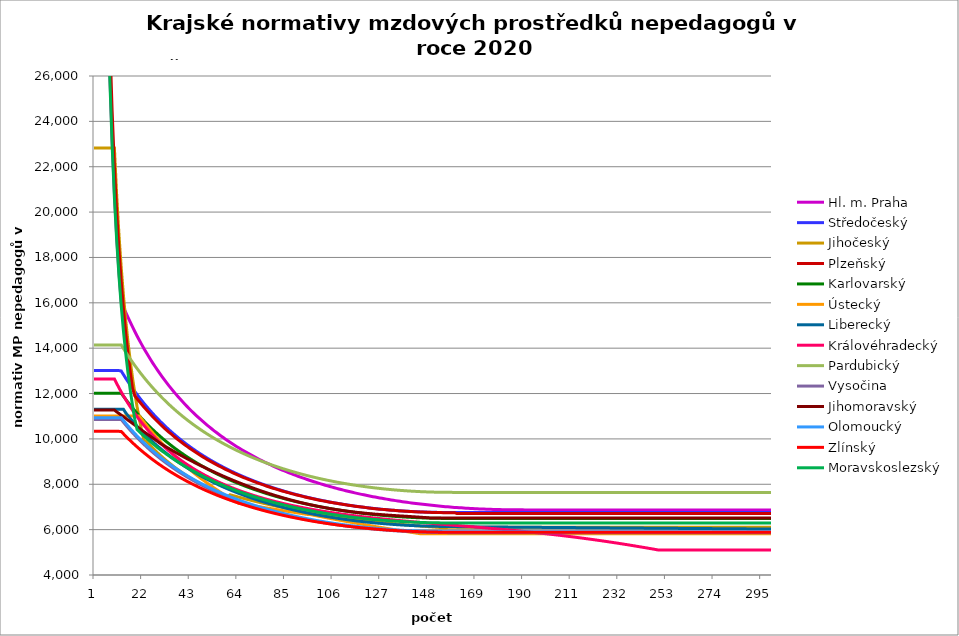
| Category | Hl. m. Praha | Středočeský | Jihočeský | Plzeňský | Karlovarský  | Ústecký   | Liberecký | Královéhradecký | Pardubický | Vysočina | Jihomoravský | Olomoucký | Zlínský | Moravskoslezský |
|---|---|---|---|---|---|---|---|---|---|---|---|---|---|---|
| 0 | 208320 | 13011.111 | 22826.448 | 219984 | 12015.95 | 11012.324 | 11306.231 | 12641.778 | 14143.911 | 10858.532 | 11272.666 | 10937.037 | 10332.651 | 206400 |
| 1 | 104160 | 13011.111 | 22826.448 | 109992 | 12015.95 | 11012.324 | 11306.231 | 12641.778 | 14143.911 | 10858.532 | 11272.666 | 10937.037 | 10332.651 | 103200 |
| 2 | 69440 | 13011.111 | 22826.448 | 73328 | 12015.95 | 11012.324 | 11306.231 | 12641.778 | 14143.911 | 10858.532 | 11272.666 | 10937.037 | 10332.651 | 68800 |
| 3 | 52080 | 13011.111 | 22826.448 | 54996 | 12015.95 | 11012.324 | 11306.231 | 12641.778 | 14143.911 | 10858.532 | 11272.666 | 10937.037 | 10332.651 | 51600 |
| 4 | 41664 | 13011.111 | 22826.448 | 43996.8 | 12015.95 | 11012.324 | 11306.231 | 12641.778 | 14143.911 | 10858.532 | 11272.666 | 10937.037 | 10332.651 | 41280 |
| 5 | 34720 | 13011.111 | 22826.448 | 36664 | 12015.95 | 11012.324 | 11306.231 | 12641.778 | 14143.911 | 10858.532 | 11272.666 | 10937.037 | 10332.651 | 34400 |
| 6 | 29760 | 13011.111 | 22826.448 | 31426.286 | 12015.95 | 11012.324 | 11306.231 | 12641.778 | 14143.911 | 10858.532 | 11272.666 | 10937.037 | 10332.651 | 29485.714 |
| 7 | 26040 | 13011.111 | 22826.448 | 27498 | 12015.95 | 11012.324 | 11306.231 | 12641.778 | 14143.911 | 10858.532 | 11272.666 | 10937.037 | 10332.651 | 25800 |
| 8 | 23146.667 | 13011.111 | 22826.448 | 24442.667 | 12015.95 | 11012.324 | 11306.231 | 12641.778 | 14143.911 | 10858.532 | 11272.666 | 10937.037 | 10332.651 | 22933.333 |
| 9 | 20832 | 13011.111 | 22826.448 | 21998.4 | 12015.95 | 11012.324 | 11306.231 | 12641.778 | 14143.911 | 10858.532 | 11272.666 | 10937.037 | 10332.651 | 20640 |
| 10 | 18938.182 | 13011.111 | 20751.316 | 19998.545 | 12015.95 | 11012.324 | 11306.231 | 12445.114 | 14143.911 | 10858.532 | 11191.909 | 10937.037 | 10332.651 | 18763.636 |
| 11 | 17360 | 13011.111 | 19022.04 | 18332 | 12015.95 | 11012.324 | 11306.231 | 12254.476 | 14143.911 | 10858.532 | 11121.608 | 10937.037 | 10332.651 | 17200 |
| 12 | 16054.056 | 12995.318 | 17558.806 | 16921.846 | 12016.057 | 11012.324 | 11306.231 | 12069.59 | 14144.036 | 10858.532 | 11047.587 | 10937.037 | 10328.67 | 15876.923 |
| 13 | 15814.598 | 12832.408 | 16304.606 | 15713.143 | 11878.17 | 11012.324 | 11306.231 | 11895.725 | 13981.73 | 10733.953 | 10974.545 | 10808.366 | 10223.34 | 14742.857 |
| 14 | 15583.483 | 12674.618 | 15217.632 | 14665.6 | 11744.327 | 11012.324 | 11146.971 | 11732.172 | 13824.185 | 10613.014 | 10902.463 | 10687.29 | 10120.838 | 13760 |
| 15 | 15360.294 | 12521.721 | 14266.53 | 13749 | 11614.362 | 11012.324 | 11022.551 | 11567.826 | 13671.203 | 10495.566 | 10826.906 | 10568.896 | 10021.06 | 12900 |
| 16 | 15144.642 | 12373.503 | 13427.322 | 12940.235 | 11488.118 | 11012.324 | 10901.716 | 11413.107 | 13522.602 | 10381.466 | 10756.744 | 10453.097 | 9923.905 | 12141.176 |
| 17 | 14936.16 | 12229.765 | 12681.36 | 12221.333 | 11365.446 | 11012.324 | 10784.322 | 11262.473 | 13378.206 | 10270.583 | 10683.186 | 10344.12 | 9829.278 | 11466.667 |
| 18 | 14734.507 | 12090.316 | 12013.92 | 11898.745 | 11246.206 | 11012.324 | 10670.232 | 11120.591 | 13237.849 | 10162.789 | 10610.627 | 10233.168 | 9737.088 | 10863.158 |
| 19 | 14539.363 | 11954.977 | 11413.224 | 11771.404 | 11130.263 | 11012.324 | 10559.318 | 10982.239 | 13101.374 | 10057.965 | 10534.867 | 10128.706 | 9647.249 | 10417.508 |
| 20 | 14350.428 | 11823.58 | 10869.737 | 11646.76 | 11017.493 | 11012.324 | 10451.456 | 10847.288 | 12968.632 | 9956.354 | 10464.303 | 10026.354 | 9559.679 | 10320.021 |
| 21 | 14167.419 | 11695.965 | 10375.658 | 11524.728 | 10907.775 | 10878.261 | 10346.53 | 10720.101 | 12839.483 | 9857.128 | 10390.61 | 9926.05 | 9474.299 | 10225.03 |
| 22 | 13990.072 | 11571.98 | 9924.543 | 11405.226 | 10800.994 | 10747.423 | 10244.431 | 10595.861 | 12713.792 | 9760.547 | 10317.949 | 9831.629 | 9391.036 | 10132.448 |
| 23 | 13818.136 | 11451.483 | 9908.446 | 11292.813 | 10697.043 | 10619.694 | 10145.052 | 10478.756 | 12591.433 | 9666.515 | 10246.296 | 9735.165 | 9309.817 | 10042.193 |
| 24 | 13651.376 | 11334.338 | 9798.737 | 11182.595 | 10595.819 | 10494.966 | 10048.296 | 10360.016 | 12472.282 | 9575.271 | 10175.632 | 9644.323 | 9230.575 | 9954.184 |
| 25 | 13489.572 | 11220.416 | 9692.54 | 11074.507 | 10497.225 | 10373.134 | 9954.066 | 10248.038 | 12356.227 | 9486.059 | 10105.936 | 9555.162 | 9153.244 | 9868.346 |
| 26 | 13332.514 | 11109.596 | 9589.707 | 10968.488 | 10401.166 | 10258.303 | 9862.274 | 10142.472 | 12243.157 | 9399.131 | 10033.396 | 9467.634 | 9077.763 | 9784.606 |
| 27 | 13180.005 | 11001.762 | 9490.097 | 10864.48 | 10307.554 | 10141.873 | 9772.832 | 10035.123 | 12132.967 | 9314.722 | 9961.89 | 9381.694 | 9004.073 | 9702.896 |
| 28 | 13031.859 | 10896.803 | 9393.578 | 10766.641 | 10216.305 | 10028.056 | 9685.66 | 9937.733 | 12025.558 | 9232.123 | 9891.397 | 9297.301 | 8932.115 | 9623.149 |
| 29 | 12887.899 | 10794.617 | 9300.023 | 10666.408 | 10127.339 | 9916.766 | 9600.68 | 9838.432 | 11920.836 | 9151.884 | 9818.262 | 9217.837 | 8861.837 | 9545.303 |
| 30 | 12747.959 | 10695.102 | 9209.316 | 10572.088 | 10040.577 | 9807.918 | 9517.817 | 9744.804 | 11818.709 | 9073.621 | 9756.943 | 9136.354 | 8793.187 | 9469.297 |
| 31 | 12611.88 | 10598.164 | 9121.343 | 10479.421 | 9955.947 | 9701.435 | 9437 | 9652.941 | 11719.092 | 8996.979 | 9696.386 | 9059.606 | 8726.113 | 9395.074 |
| 32 | 12479.512 | 10503.714 | 9036 | 10392.29 | 9873.379 | 9597.238 | 9358.161 | 9562.794 | 11621.902 | 8922.195 | 9636.575 | 8984.136 | 8660.569 | 9322.577 |
| 33 | 12350.715 | 10411.665 | 8953.186 | 10302.735 | 9792.806 | 9495.256 | 9281.237 | 9477.823 | 11527.059 | 8849.492 | 9577.497 | 8913.115 | 8596.508 | 9251.755 |
| 34 | 12225.352 | 10321.936 | 8872.806 | 10218.506 | 9714.163 | 9395.419 | 9206.165 | 9394.349 | 11434.489 | 8778.521 | 9519.14 | 8840.057 | 8533.888 | 9182.557 |
| 35 | 12103.296 | 10234.448 | 8794.77 | 10131.909 | 9637.39 | 9297.659 | 9132.885 | 9312.332 | 11344.12 | 8709.227 | 9461.489 | 8771.287 | 8472.665 | 9114.933 |
| 36 | 11984.426 | 10149.128 | 8718.993 | 10050.439 | 9562.427 | 9201.912 | 9061.343 | 9235.065 | 11255.882 | 8641.288 | 9404.533 | 8703.579 | 8412.799 | 9048.837 |
| 37 | 11868.625 | 10065.903 | 8645.394 | 9970.268 | 9489.22 | 9111.435 | 8991.482 | 9159.07 | 11169.71 | 8575.197 | 9348.258 | 8636.908 | 8354.252 | 8984.225 |
| 38 | 11755.783 | 9984.705 | 8573.895 | 9894.926 | 9417.713 | 9019.466 | 8923.253 | 9084.315 | 11085.54 | 8510.372 | 9292.652 | 8571.251 | 8296.985 | 8921.054 |
| 39 | 11645.796 | 9905.471 | 8504.423 | 9817.208 | 9347.856 | 8929.336 | 8856.604 | 9010.771 | 11003.311 | 8447.291 | 9237.704 | 8506.584 | 8240.964 | 8859.282 |
| 40 | 11538.564 | 9828.137 | 8436.909 | 9744.153 | 9279.599 | 8840.989 | 8791.489 | 8941.53 | 10922.967 | 8385.901 | 9183.402 | 8445.761 | 8186.153 | 8798.869 |
| 41 | 11433.991 | 9752.644 | 8371.286 | 9672.177 | 9212.895 | 8754.374 | 8727.861 | 8873.345 | 10844.45 | 8325.397 | 9129.735 | 8385.801 | 8132.52 | 8739.778 |
| 42 | 11331.987 | 9678.936 | 8307.491 | 9601.257 | 9147.699 | 8669.439 | 8665.677 | 8809.222 | 10767.707 | 8266.5 | 9079.795 | 8323.893 | 8080.032 | 8681.972 |
| 43 | 11232.465 | 9606.957 | 8245.465 | 9531.369 | 9083.966 | 8586.136 | 8604.896 | 8743.033 | 10692.688 | 8208.916 | 9027.328 | 8268.4 | 8028.66 | 8625.416 |
| 44 | 11135.343 | 9536.656 | 8185.149 | 9462.491 | 9021.656 | 8504.419 | 8545.476 | 8680.773 | 10619.343 | 8152.61 | 8975.465 | 8210.924 | 7978.372 | 8570.076 |
| 45 | 11040.541 | 9467.982 | 8126.489 | 9397.813 | 8960.727 | 8424.242 | 8487.38 | 8619.394 | 10547.624 | 8097.781 | 8924.194 | 8154.241 | 7929.142 | 8515.919 |
| 46 | 10947.984 | 9400.887 | 8069.433 | 9334.012 | 8901.142 | 8345.564 | 8430.569 | 8561.739 | 10477.487 | 8043.684 | 8873.505 | 8100.98 | 7880.941 | 8462.915 |
| 47 | 10857.6 | 9335.326 | 8013.932 | 9271.072 | 8842.863 | 8268.341 | 8375.009 | 8504.85 | 10408.887 | 7990.997 | 8823.389 | 8048.41 | 7833.743 | 8411.032 |
| 48 | 10769.32 | 9271.254 | 7959.937 | 9208.975 | 8785.855 | 8195.218 | 8320.664 | 8448.713 | 10341.782 | 7939.451 | 8776.735 | 7996.518 | 7787.522 | 8360.242 |
| 49 | 10683.077 | 9208.629 | 7907.404 | 9147.705 | 8730.082 | 8120.74 | 8267.503 | 8393.311 | 10276.133 | 7889.24 | 8727.703 | 7945.291 | 7742.255 | 8310.517 |
| 50 | 10598.808 | 9147.41 | 7856.288 | 9087.244 | 8675.513 | 8047.604 | 8215.492 | 8341.349 | 10211.9 | 7839.882 | 8679.216 | 7894.717 | 7697.917 | 8261.83 |
| 51 | 10516.453 | 9087.558 | 7806.549 | 9030.542 | 8622.115 | 7975.773 | 8164.602 | 8290.026 | 10149.045 | 7791.576 | 8631.264 | 7847.264 | 7654.485 | 8214.154 |
| 52 | 10435.954 | 9029.035 | 7758.147 | 8974.543 | 8569.858 | 7905.213 | 8114.803 | 8239.331 | 10087.534 | 7744.295 | 8586.615 | 7800.377 | 7611.938 | 8167.465 |
| 53 | 10357.254 | 8971.805 | 7711.044 | 8919.235 | 8518.712 | 7835.891 | 8066.067 | 8189.251 | 10027.33 | 7698.013 | 8539.678 | 7754.048 | 7570.253 | 8121.738 |
| 54 | 10280.3 | 8915.834 | 7665.203 | 8864.603 | 8468.649 | 7767.774 | 8018.366 | 8142.366 | 9968.401 | 7652.914 | 8493.252 | 7708.266 | 7529.412 | 8076.95 |
| 55 | 10205.041 | 8861.087 | 7620.59 | 8813.462 | 8419.641 | 7700.831 | 7971.674 | 8096.015 | 9910.714 | 7608.759 | 8450.016 | 7663.021 | 7489.393 | 8033.079 |
| 56 | 10131.428 | 8807.533 | 7577.172 | 8760.115 | 8371.662 | 7635.032 | 7925.966 | 8050.189 | 9854.239 | 7565.317 | 8404.557 | 7618.305 | 7450.177 | 7990.102 |
| 57 | 10059.414 | 8755.14 | 7534.916 | 8710.168 | 8324.687 | 7570.348 | 7881.217 | 8007.382 | 9798.945 | 7522.777 | 8359.585 | 7576.42 | 7411.747 | 7947.999 |
| 58 | 9988.952 | 8703.879 | 7493.792 | 8660.787 | 8278.692 | 7506.751 | 7837.404 | 7962.551 | 9744.804 | 7481.117 | 8317.695 | 7534.994 | 7374.083 | 7906.749 |
| 59 | 9920 | 8653.722 | 7453.771 | 8611.964 | 8233.651 | 7446.429 | 7794.504 | 7920.668 | 9691.787 | 7440.516 | 8273.645 | 7494.018 | 7337.17 | 7866.333 |
| 60 | 9852.515 | 8604.639 | 7537.567 | 8563.687 | 8189.543 | 7384.888 | 7752.495 | 7881.65 | 9639.868 | 7400.748 | 8232.61 | 7453.486 | 7300.989 | 7826.732 |
| 61 | 9786.457 | 8556.606 | 7509.433 | 8518.587 | 8146.346 | 7324.356 | 7711.356 | 7840.613 | 9589.02 | 7361.599 | 8189.454 | 7413.389 | 7265.525 | 7787.927 |
| 62 | 9721.787 | 8509.595 | 7481.701 | 8471.349 | 8104.038 | 7264.808 | 7671.066 | 7802.377 | 9539.219 | 7323.443 | 8149.248 | 7375.914 | 7230.762 | 7749.9 |
| 63 | 9658.467 | 8463.582 | 7454.365 | 8427.214 | 8062.598 | 7206.221 | 7631.606 | 7764.513 | 9490.441 | 7285.872 | 8106.96 | 7338.817 | 7196.686 | 7712.636 |
| 64 | 9596.462 | 8418.543 | 7427.419 | 8383.537 | 8022.007 | 7148.571 | 7592.956 | 7727.015 | 9442.662 | 7249.254 | 8067.558 | 7299.941 | 7163.28 | 7676.116 |
| 65 | 9535.737 | 8374.455 | 7400.856 | 8340.309 | 7982.246 | 7148.571 | 7555.098 | 7689.877 | 9395.859 | 7213.378 | 8028.537 | 7263.602 | 7130.532 | 7640.324 |
| 66 | 9476.258 | 8331.295 | 7374.671 | 8297.526 | 7943.296 | 7130.237 | 7518.015 | 7655.383 | 9350.011 | 7178.227 | 7989.892 | 7229.729 | 7098.427 | 7605.246 |
| 67 | 9417.994 | 8289.043 | 7348.857 | 8257.658 | 7905.138 | 7114.018 | 7481.689 | 7621.197 | 9305.096 | 7143.602 | 7951.617 | 7194.084 | 7066.952 | 7570.867 |
| 68 | 9360.913 | 8247.677 | 7323.409 | 8218.171 | 7867.757 | 7095.859 | 7446.103 | 7587.315 | 9261.094 | 7109.856 | 7913.707 | 7160.855 | 7036.094 | 7537.171 |
| 69 | 9304.985 | 8207.177 | 7298.32 | 8179.06 | 7831.134 | 7079.796 | 7411.242 | 7553.733 | 9217.986 | 7076.789 | 7876.157 | 7127.931 | 7005.841 | 7504.145 |
| 70 | 9250.181 | 8167.524 | 7273.586 | 8140.32 | 7795.254 | 7061.812 | 7377.089 | 7522.656 | 9175.752 | 7044.387 | 7838.961 | 7095.309 | 6976.181 | 7471.775 |
| 71 | 9196.474 | 8128.699 | 7249.201 | 8101.945 | 7760.101 | 7043.919 | 7343.63 | 7489.643 | 9134.373 | 7012.636 | 7802.115 | 7062.984 | 6947.101 | 7440.047 |
| 72 | 9143.836 | 8090.683 | 7225.159 | 8063.93 | 7725.659 | 7028.09 | 7310.851 | 7459.091 | 9093.832 | 6981.345 | 7767.885 | 7030.952 | 6918.591 | 7408.95 |
| 73 | 9092.242 | 8053.46 | 7201.455 | 8028.613 | 7691.915 | 7010.367 | 7278.736 | 7428.787 | 9054.112 | 6950.856 | 7731.703 | 7001.185 | 6890.639 | 7378.47 |
| 74 | 9041.667 | 8017.013 | 7178.084 | 7993.605 | 7658.853 | 6992.733 | 7247.273 | 7400.867 | 9015.195 | 6921.151 | 7698.087 | 6969.711 | 6863.235 | 7348.595 |
| 75 | 8992.085 | 7981.325 | 7155.042 | 7958.9 | 7626.461 | 6977.133 | 7216.448 | 7371.034 | 8977.066 | 6891.87 | 7664.762 | 6940.459 | 6836.368 | 7319.315 |
| 76 | 8943.475 | 7946.379 | 7132.323 | 7924.496 | 7594.724 | 6959.666 | 7186.248 | 7343.546 | 8939.709 | 6863.176 | 7629.532 | 6911.452 | 6810.029 | 7290.617 |
| 77 | 8895.812 | 7912.162 | 7109.922 | 7890.387 | 7563.63 | 6944.213 | 7156.661 | 7316.262 | 8903.108 | 6835.057 | 7596.796 | 6882.686 | 6784.207 | 7262.491 |
| 78 | 8849.076 | 7878.658 | 7087.836 | 7858.817 | 7533.166 | 6926.91 | 7127.675 | 7289.18 | 8867.249 | 6807.502 | 7566.496 | 6856.053 | 6758.893 | 7234.926 |
| 79 | 8803.245 | 7845.852 | 7066.059 | 7825.27 | 7503.32 | 6909.693 | 7099.279 | 7264.359 | 8832.118 | 6780.501 | 7534.298 | 6829.626 | 6734.079 | 7207.912 |
| 80 | 8758.299 | 7813.732 | 7044.587 | 7794.218 | 7474.08 | 6894.461 | 7071.46 | 7237.659 | 8797.7 | 6754.207 | 7502.373 | 6801.536 | 6709.754 | 7181.438 |
| 81 | 8714.218 | 7782.282 | 7023.416 | 7763.411 | 7445.436 | 6877.405 | 7044.209 | 7213.187 | 8763.983 | 6728.28 | 7472.819 | 6775.526 | 6685.911 | 7155.496 |
| 82 | 8670.982 | 7751.491 | 7002.541 | 7735.021 | 7417.375 | 6860.433 | 7017.514 | 7188.88 | 8730.953 | 6702.875 | 7443.498 | 6749.714 | 6662.54 | 7130.076 |
| 83 | 8628.574 | 7721.346 | 6981.958 | 7704.679 | 7389.887 | 6845.417 | 6991.366 | 7164.736 | 8698.597 | 6677.984 | 7412.336 | 6725.922 | 6639.635 | 7105.167 |
| 84 | 8586.974 | 7691.834 | 6961.664 | 7676.717 | 7362.963 | 6828.603 | 6965.754 | 7140.753 | 8666.904 | 6653.757 | 7385.539 | 6700.486 | 6617.187 | 7080.763 |
| 85 | 8546.167 | 7662.944 | 6941.653 | 7646.83 | 7336.59 | 6813.725 | 6940.669 | 7118.91 | 8635.861 | 6630.022 | 7356.898 | 6677.039 | 6595.188 | 7056.854 |
| 86 | 8506.135 | 7634.664 | 6921.923 | 7619.285 | 7310.761 | 6797.066 | 6916.101 | 7095.233 | 8605.458 | 6606.613 | 7328.477 | 6653.755 | 6573.631 | 7033.432 |
| 87 | 8466.861 | 7606.983 | 6902.47 | 7591.938 | 7285.466 | 6780.488 | 6892.042 | 7073.667 | 8575.683 | 6583.682 | 7302.282 | 6630.634 | 6552.509 | 7010.489 |
| 88 | 8428.33 | 7579.891 | 6883.29 | 7566.868 | 7260.694 | 6765.819 | 6868.482 | 7052.231 | 8546.524 | 6561.221 | 7276.274 | 6607.672 | 6531.814 | 6988.016 |
| 89 | 8390.527 | 7553.377 | 6864.379 | 7539.896 | 7236.438 | 6749.393 | 6845.413 | 7032.857 | 8517.973 | 6539.375 | 7250.45 | 6586.617 | 6511.54 | 6966.007 |
| 90 | 8353.436 | 7527.43 | 6845.733 | 7515.168 | 7212.689 | 6733.046 | 6822.827 | 7011.668 | 8490.018 | 6517.982 | 7224.81 | 6563.959 | 6491.681 | 6944.454 |
| 91 | 8317.044 | 7502.042 | 6827.35 | 7490.602 | 7189.439 | 6718.582 | 6800.716 | 6990.606 | 8462.65 | 6496.88 | 7199.349 | 6543.181 | 6472.229 | 6923.349 |
| 92 | 8281.336 | 7477.202 | 6809.225 | 7466.196 | 7166.678 | 6702.384 | 6779.072 | 6971.569 | 8435.858 | 6476.369 | 7176.006 | 6522.535 | 6453.179 | 6902.687 |
| 93 | 8246.3 | 7452.902 | 6791.356 | 7441.949 | 7144.4 | 6688.051 | 6757.887 | 6952.634 | 8409.635 | 6456.137 | 7152.814 | 6502.018 | 6434.524 | 6882.459 |
| 94 | 8211.921 | 7429.133 | 6773.739 | 7417.858 | 7122.597 | 6672 | 6737.155 | 6933.803 | 8383.971 | 6436.48 | 7129.772 | 6481.631 | 6416.26 | 6862.66 |
| 95 | 8178.186 | 7405.885 | 6756.371 | 7395.912 | 7101.261 | 6672 | 6716.867 | 6915.073 | 8358.856 | 6417.24 | 7106.877 | 6463.054 | 6398.379 | 6843.284 |
| 96 | 8145.085 | 7383.151 | 6739.249 | 7374.095 | 7080.385 | 6652.486 | 6697.018 | 6896.444 | 8334.284 | 6398.41 | 7086.019 | 6444.583 | 6380.876 | 6824.323 |
| 97 | 8112.604 | 7360.922 | 6722.37 | 7352.406 | 7059.963 | 6633.086 | 6677.6 | 6879.764 | 8310.245 | 6379.838 | 7065.283 | 6424.553 | 6363.746 | 6805.772 |
| 98 | 8080.733 | 7339.191 | 6705.73 | 7330.845 | 7039.987 | 6612.051 | 6658.607 | 6861.324 | 8286.731 | 6361.811 | 7042.8 | 6406.302 | 6346.985 | 6787.625 |
| 99 | 8049.459 | 7317.95 | 6689.328 | 7309.41 | 7020.45 | 6592.885 | 6640.033 | 6844.813 | 8263.735 | 6344.177 | 7024.173 | 6389.799 | 6330.586 | 6769.877 |
| 100 | 8018.772 | 7297.191 | 6673.159 | 7288.1 | 7001.348 | 6573.831 | 6621.872 | 6828.381 | 8241.249 | 6326.929 | 7003.797 | 6371.744 | 6314.544 | 6752.521 |
| 101 | 7988.661 | 7276.908 | 6657.222 | 7268.834 | 6982.672 | 6554.886 | 6604.117 | 6812.028 | 8219.266 | 6310.062 | 6985.376 | 6355.419 | 6298.856 | 6735.554 |
| 102 | 7959.116 | 7257.093 | 6641.513 | 7249.67 | 6964.418 | 6534.343 | 6586.763 | 6795.753 | 8197.779 | 6293.571 | 6967.051 | 6337.557 | 6283.516 | 6718.969 |
| 103 | 7930.127 | 7237.74 | 6626.03 | 7230.607 | 6946.579 | 6515.625 | 6569.805 | 6779.555 | 8176.781 | 6277.45 | 6948.823 | 6321.407 | 6268.52 | 6702.761 |
| 104 | 7901.684 | 7218.842 | 6610.77 | 7211.644 | 6929.15 | 6497.014 | 6553.236 | 6765.222 | 8156.265 | 6261.695 | 6930.689 | 6306.941 | 6253.863 | 6686.926 |
| 105 | 7873.778 | 7200.394 | 6595.731 | 7194.662 | 6912.125 | 6478.509 | 6537.053 | 6749.17 | 8136.226 | 6246.301 | 6914.449 | 6290.946 | 6239.542 | 6671.459 |
| 106 | 7846.399 | 7182.388 | 6580.909 | 7175.887 | 6895.5 | 6460.108 | 6521.249 | 6734.964 | 8116.656 | 6231.263 | 6898.286 | 6275.032 | 6225.551 | 6656.355 |
| 107 | 7819.538 | 7164.818 | 6566.303 | 7159.073 | 6879.268 | 6440.154 | 6505.82 | 6720.819 | 8097.549 | 6216.575 | 6882.197 | 6260.777 | 6211.888 | 6641.61 |
| 108 | 7793.187 | 7147.68 | 6551.91 | 7142.338 | 6863.425 | 6421.971 | 6490.761 | 6704.976 | 8078.901 | 6202.235 | 6867.96 | 6246.588 | 6198.547 | 6627.22 |
| 109 | 7767.338 | 7130.968 | 6537.728 | 7125.68 | 6847.966 | 6403.89 | 6476.067 | 6690.957 | 8060.704 | 6188.376 | 6852.012 | 6232.462 | 6185.526 | 6613.18 |
| 110 | 7741.982 | 7114.676 | 6523.755 | 7109.1 | 6832.887 | 6385.911 | 6461.734 | 6678.737 | 8042.954 | 6174.716 | 6837.899 | 6218.401 | 6172.821 | 6599.487 |
| 111 | 7717.11 | 7098.798 | 6509.987 | 7094.427 | 6818.182 | 6366.412 | 6447.758 | 6664.827 | 8025.645 | 6161.39 | 6823.844 | 6205.954 | 6160.428 | 6586.135 |
| 112 | 7692.717 | 7083.331 | 6496.424 | 7077.992 | 6803.847 | 6348.642 | 6434.134 | 6650.974 | 8008.773 | 6148.395 | 6811.593 | 6192.012 | 6148.343 | 6573.123 |
| 113 | 7668.793 | 7068.268 | 6483.062 | 7063.447 | 6789.879 | 6330.972 | 6420.858 | 6638.9 | 7992.331 | 6135.862 | 6797.645 | 6179.671 | 6136.564 | 6560.445 |
| 114 | 7645.332 | 7053.606 | 6469.9 | 7048.962 | 6777.967 | 6313.399 | 6407.927 | 6625.155 | 7976.315 | 6123.516 | 6785.488 | 6167.379 | 6125.087 | 6548.099 |
| 115 | 7622.326 | 7039.34 | 6456.935 | 7034.536 | 6763.025 | 6295.924 | 6395.336 | 6613.175 | 7960.72 | 6111.624 | 6773.374 | 6155.136 | 6113.91 | 6536.08 |
| 116 | 7599.769 | 7025.464 | 6444.166 | 7020.168 | 6750.131 | 6276.969 | 6383.082 | 6601.238 | 7945.543 | 6099.912 | 6761.303 | 6142.942 | 6103.028 | 6524.386 |
| 117 | 7577.653 | 7011.976 | 6431.59 | 7007.645 | 6737.587 | 6259.695 | 6371.161 | 6587.648 | 7930.778 | 6088.513 | 6750.991 | 6132.311 | 6092.439 | 6513.013 |
| 118 | 7555.973 | 6998.871 | 6419.205 | 6995.167 | 6725.39 | 6242.515 | 6359.57 | 6575.803 | 7916.42 | 6077.556 | 6740.711 | 6120.207 | 6082.14 | 6501.959 |
| 119 | 7534.722 | 6986.144 | 6407.01 | 6982.732 | 6713.536 | 6225.429 | 6348.305 | 6564 | 7902.467 | 6066.905 | 6730.461 | 6109.655 | 6072.129 | 6491.219 |
| 120 | 7513.894 | 6973.792 | 6395.003 | 6970.342 | 6702.022 | 6206.897 | 6337.363 | 6552.24 | 7888.914 | 6056.555 | 6720.243 | 6099.139 | 6062.402 | 6480.792 |
| 121 | 7493.482 | 6961.812 | 6383.182 | 6957.996 | 6690.844 | 6190.005 | 6326.742 | 6542.193 | 7875.757 | 6046.374 | 6710.056 | 6088.66 | 6052.958 | 6470.674 |
| 122 | 7473.481 | 6950.199 | 6371.544 | 6945.693 | 6680 | 6173.205 | 6316.437 | 6530.51 | 7862.993 | 6036.489 | 6701.59 | 6079.706 | 6043.793 | 6460.862 |
| 123 | 7453.886 | 6938.951 | 6360.089 | 6935.183 | 6669.487 | 6156.496 | 6306.446 | 6518.869 | 7850.617 | 6027.03 | 6693.145 | 6069.293 | 6034.906 | 6451.355 |
| 124 | 7434.69 | 6928.063 | 6348.814 | 6924.704 | 6659.3 | 6138.371 | 6296.767 | 6508.924 | 7838.627 | 6017.862 | 6683.04 | 6060.396 | 6026.293 | 6442.149 |
| 125 | 7415.888 | 6917.533 | 6337.718 | 6914.257 | 6649.438 | 6121.85 | 6287.396 | 6497.36 | 7827.018 | 6008.983 | 6676.32 | 6051.525 | 6017.954 | 6433.241 |
| 126 | 7397.475 | 6907.358 | 6326.8 | 6903.841 | 6639.898 | 6105.417 | 6278.331 | 6487.481 | 7815.789 | 6000.26 | 6667.939 | 6042.68 | 6009.885 | 6424.631 |
| 127 | 7379.446 | 6897.533 | 6316.056 | 6893.457 | 6630.677 | 6089.073 | 6269.569 | 6475.993 | 7804.935 | 5991.951 | 6659.579 | 6033.86 | 6002.084 | 6416.314 |
| 128 | 7361.797 | 6888.058 | 6305.487 | 6884.827 | 6621.773 | 6072.816 | 6261.108 | 6466.178 | 7794.453 | 5983.924 | 6652.906 | 6026.531 | 5994.55 | 6408.29 |
| 129 | 7344.521 | 6878.929 | 6295.09 | 6874.5 | 6613.182 | 6055.179 | 6252.946 | 6456.393 | 7784.342 | 5976.176 | 6644.583 | 6019.219 | 5987.28 | 6400.556 |
| 130 | 7327.615 | 6870.142 | 6284.863 | 6865.918 | 6604.904 | 6039.102 | 6245.08 | 6446.638 | 7774.597 | 5968.706 | 6637.941 | 6010.468 | 5980.273 | 6393.109 |
| 131 | 7311.074 | 6861.697 | 6274.806 | 6857.357 | 6596.935 | 6023.11 | 6237.508 | 6436.912 | 7765.217 | 5961.51 | 6631.311 | 6003.195 | 5973.527 | 6385.949 |
| 132 | 7294.894 | 6853.589 | 6264.917 | 6850.523 | 6589.273 | 6007.203 | 6230.229 | 6427.216 | 7756.199 | 5954.46 | 6624.694 | 5997.389 | 5967.041 | 6379.073 |
| 133 | 7279.07 | 6845.818 | 6255.194 | 6842 | 6581.917 | 5989.945 | 6223.24 | 6417.548 | 7747.54 | 5947.81 | 6618.091 | 5990.147 | 5960.811 | 6372.479 |
| 134 | 7263.598 | 6838.38 | 6245.637 | 6835.198 | 6574.864 | 5974.212 | 6216.538 | 6407.91 | 7739.238 | 5941.558 | 6611.501 | 5984.367 | 5954.838 | 6366.166 |
| 135 | 7248.475 | 6831.275 | 6236.243 | 6826.713 | 6568.113 | 5958.562 | 6210.124 | 6398.3 | 7731.29 | 5935.445 | 6604.924 | 5977.157 | 5949.119 | 6360.131 |
| 136 | 7233.695 | 6824.498 | 6227.011 | 6819.94 | 6561.661 | 5942.993 | 6203.994 | 6388.72 | 7723.696 | 5929.599 | 6598.36 | 5971.401 | 5943.654 | 6354.375 |
| 137 | 7219.256 | 6818.049 | 6217.94 | 6813.181 | 6555.507 | 5927.505 | 6198.147 | 6379.168 | 7716.452 | 5924.018 | 6593.446 | 5965.657 | 5938.44 | 6348.894 |
| 138 | 7205.153 | 6811.927 | 6209.029 | 6808.121 | 6549.649 | 5910.702 | 6192.582 | 6371.229 | 7709.557 | 5918.701 | 6586.905 | 5961.355 | 5933.476 | 6343.688 |
| 139 | 7191.384 | 6806.128 | 6200.276 | 6801.385 | 6544.086 | 5895.382 | 6187.296 | 6361.73 | 7703.008 | 5913.771 | 6580.377 | 5955.63 | 5928.762 | 6338.755 |
| 140 | 7177.944 | 6800.652 | 6191.68 | 6796.342 | 6538.816 | 5880.141 | 6182.289 | 6352.258 | 7696.805 | 5908.976 | 6573.861 | 5951.344 | 5924.295 | 6334.094 |
| 141 | 7164.83 | 6795.497 | 6183.241 | 6791.306 | 6533.838 | 5864.979 | 6177.56 | 6342.815 | 7690.945 | 5904.441 | 6567.359 | 5947.063 | 5920.076 | 6329.704 |
| 142 | 7152.038 | 6790.661 | 6174.956 | 6786.278 | 6529.15 | 5848.527 | 6173.107 | 6334.967 | 7685.428 | 5900.164 | 6560.87 | 5942.789 | 5916.102 | 6325.584 |
| 143 | 7139.567 | 6786.144 | 6166.825 | 6781.258 | 6524.752 | 5833.528 | 6168.928 | 6325.574 | 7680.25 | 5896.27 | 6554.393 | 5938.52 | 5912.373 | 6321.732 |
| 144 | 7127.412 | 6781.943 | 6158.847 | 6776.244 | 6520.641 | 5818.605 | 6165.023 | 6317.769 | 7675.412 | 5892.506 | 6547.929 | 5934.258 | 5908.888 | 6318.148 |
| 145 | 7115.571 | 6778.059 | 6151.019 | 6772.906 | 6516.818 | 5818.605 | 6161.391 | 6308.428 | 7670.912 | 5889.123 | 6539.867 | 5931.42 | 5905.647 | 6314.831 |
| 146 | 7104.04 | 6774.489 | 6143.343 | 6769.572 | 6513.281 | 5818.605 | 6158.031 | 6300.665 | 7666.748 | 5885.869 | 6533.432 | 5927.168 | 5902.647 | 6311.78 |
| 147 | 7092.817 | 6771.232 | 6135.815 | 6766.24 | 6510.029 | 5818.605 | 6154.941 | 6291.374 | 7662.92 | 5882.868 | 6525.405 | 5924.337 | 5899.889 | 6308.994 |
| 148 | 7081.899 | 6768.289 | 6128.436 | 6762.912 | 6507.061 | 5818.605 | 6152.122 | 6283.652 | 7659.427 | 5880.245 | 6517.399 | 5921.509 | 5897.373 | 6306.473 |
| 149 | 7071.283 | 6765.657 | 6121.204 | 6759.587 | 6504.377 | 5818.605 | 6149.572 | 6274.412 | 7656.267 | 5877.873 | 6509.412 | 5920.095 | 5895.096 | 6304.215 |
| 150 | 7060.967 | 6763.337 | 6114.119 | 6756.265 | 6501.976 | 5818.605 | 6147.29 | 6266.732 | 7653.441 | 5875.753 | 6509.412 | 5917.271 | 5893.059 | 6302.221 |
| 151 | 7050.949 | 6761.328 | 6107.178 | 6754.606 | 6499.856 | 5818.605 | 6145.277 | 6257.541 | 7650.946 | 5873.759 | 6509.412 | 5915.86 | 5891.261 | 6300.489 |
| 152 | 7041.225 | 6759.628 | 6100.383 | 6752.947 | 6498.018 | 5818.605 | 6143.531 | 6249.902 | 7648.783 | 5872.016 | 6509.412 | 5914.449 | 5889.703 | 6299.02 |
| 153 | 7031.794 | 6758.239 | 6093.73 | 6751.289 | 6496.462 | 5818.605 | 6142.052 | 6240.761 | 7646.951 | 5870.646 | 6509.412 | 5913.039 | 5888.382 | 6297.813 |
| 154 | 7022.654 | 6757.158 | 6087.221 | 6749.632 | 6495.186 | 5818.605 | 6140.84 | 6233.163 | 7645.449 | 5869.527 | 6509.412 | 5911.63 | 5887.3 | 6296.868 |
| 155 | 7013.801 | 6756.386 | 6080.853 | 6749.632 | 6494.191 | 5818.605 | 6139.894 | 6224.07 | 7644.277 | 5868.656 | 6509.412 | 5910.222 | 5886.456 | 6296.184 |
| 156 | 7005.235 | 6755.924 | 6099.74 | 6747.975 | 6493.475 | 5818.605 | 6139.215 | 6216.513 | 7643.435 | 5868.034 | 6509.412 | 5910.222 | 5885.849 | 6295.762 |
| 157 | 6996.953 | 6755.769 | 6099.74 | 6747.975 | 6493.04 | 5818.605 | 6137 | 6207.468 | 7642.923 | 5867.537 | 6509.412 | 5908.814 | 5885.479 | 6295.754 |
| 158 | 6988.953 | 6755.924 | 6099.74 | 6747.975 | 6492.885 | 5818.605 | 6135.525 | 6199.952 | 7642.74 | 5867.412 | 6509.412 | 5908.814 | 5885.348 | 6295.7 |
| 159 | 6981.233 | 6755.769 | 6099.74 | 6747.975 | 6493.009 | 5818.605 | 6134.05 | 6190.955 | 7642.52 | 5867.288 | 6509.412 | 5908.814 | 5883.871 | 6295.754 |
| 160 | 6973.792 | 6755.769 | 6099.74 | 6706.829 | 6492.698 | 5818.605 | 6132.576 | 6183.478 | 7642.52 | 5867.288 | 6509.412 | 5908.814 | 5883.871 | 6295.754 |
| 161 | 6966.628 | 6755.769 | 6099.74 | 6706.829 | 6492.698 | 5818.605 | 6131.102 | 6174.53 | 7642.52 | 5867.288 | 6509.412 | 5908.814 | 5883.871 | 6295.754 |
| 162 | 6959.738 | 6755.769 | 6099.74 | 6706.829 | 6492.698 | 5818.605 | 6129.629 | 6167.092 | 7642.52 | 5867.288 | 6509.412 | 5908.814 | 5883.871 | 6295.754 |
| 163 | 6953.122 | 6755.769 | 6099.74 | 6706.829 | 6492.698 | 5818.605 | 6128.157 | 6158.191 | 7642.52 | 5867.288 | 6509.412 | 5908.814 | 5883.871 | 6295.754 |
| 164 | 6946.779 | 6755.769 | 6099.74 | 6706.829 | 6492.698 | 5818.605 | 6126.686 | 6150.793 | 7642.52 | 5867.288 | 6509.412 | 5908.814 | 5883.871 | 6295.754 |
| 165 | 6940.705 | 6755.769 | 6099.74 | 6706.829 | 6492.698 | 5818.605 | 6125.215 | 6141.939 | 7642.52 | 5867.288 | 6509.412 | 5908.814 | 5883.871 | 6295.754 |
| 166 | 6934.901 | 6755.769 | 6099.74 | 6706.829 | 6492.698 | 5818.605 | 6123.745 | 6133.11 | 7642.52 | 5867.288 | 6509.412 | 5908.814 | 5883.871 | 6295.754 |
| 167 | 6929.365 | 6755.769 | 6099.74 | 6706.829 | 6492.698 | 5818.605 | 6122.276 | 6124.306 | 7642.52 | 5867.288 | 6509.412 | 5908.814 | 5883.871 | 6295.754 |
| 168 | 6924.096 | 6755.769 | 6099.74 | 6706.829 | 6492.698 | 5818.605 | 6121.412 | 6116.989 | 7642.52 | 5867.288 | 6509.412 | 5908.814 | 5883.871 | 6295.754 |
| 169 | 6919.091 | 6755.769 | 6099.74 | 6706.829 | 6492.698 | 5818.605 | 6120.808 | 6108.232 | 7642.52 | 5867.288 | 6509.412 | 5908.814 | 5883.871 | 6295.754 |
| 170 | 6914.351 | 6755.769 | 6099.74 | 6706.829 | 6492.698 | 5818.605 | 6120.01 | 6099.5 | 7642.52 | 5867.288 | 6509.412 | 5908.814 | 5883.871 | 6295.754 |
| 171 | 6909.874 | 6755.769 | 6099.74 | 6706.829 | 6492.698 | 5818.605 | 6119.265 | 6090.792 | 7642.52 | 5867.288 | 6509.412 | 5908.814 | 5883.871 | 6295.754 |
| 172 | 6905.66 | 6755.769 | 6099.74 | 6706.829 | 6492.698 | 5818.605 | 6118.521 | 6082.11 | 7642.52 | 5867.288 | 6509.412 | 5908.814 | 5883.871 | 6295.754 |
| 173 | 6901.706 | 6755.769 | 6099.74 | 6706.829 | 6492.698 | 5818.605 | 6117.776 | 6073.452 | 7642.52 | 5867.288 | 6509.412 | 5908.814 | 5883.871 | 6295.754 |
| 174 | 6898.013 | 6755.769 | 6099.74 | 6706.829 | 6492.698 | 5818.605 | 6117.031 | 6064.819 | 7642.52 | 5867.288 | 6509.412 | 5908.814 | 5883.871 | 6295.754 |
| 175 | 6894.58 | 6755.769 | 6099.74 | 6706.829 | 6492.698 | 5818.605 | 6116.287 | 6056.21 | 7642.52 | 5867.288 | 6509.412 | 5908.814 | 5883.871 | 6295.754 |
| 176 | 6891.405 | 6755.769 | 6099.74 | 6706.829 | 6492.698 | 5818.605 | 6115.543 | 6047.626 | 7642.52 | 5867.288 | 6509.412 | 5908.814 | 5883.871 | 6295.754 |
| 177 | 6888.488 | 6755.769 | 6099.74 | 6706.829 | 6492.698 | 5818.605 | 6114.799 | 6039.066 | 7642.52 | 5867.288 | 6509.412 | 5908.814 | 5883.871 | 6295.754 |
| 178 | 6885.829 | 6755.769 | 6099.74 | 6706.829 | 6492.698 | 5818.605 | 6114.056 | 6029.11 | 7642.52 | 5867.288 | 6509.412 | 5908.814 | 5883.871 | 6295.754 |
| 179 | 6883.426 | 6755.769 | 6099.74 | 6706.829 | 6492.698 | 5818.605 | 6113.312 | 6020.602 | 7642.52 | 5867.288 | 6509.412 | 5908.814 | 5883.871 | 6295.754 |
| 180 | 6881.279 | 6755.769 | 6099.74 | 6706.829 | 6492.698 | 5818.605 | 6112.569 | 6012.118 | 7642.52 | 5867.288 | 6509.412 | 5908.814 | 5883.871 | 6295.754 |
| 181 | 6879.389 | 6755.769 | 6099.74 | 6706.829 | 6492.698 | 5818.605 | 6111.825 | 6002.251 | 7642.52 | 5867.288 | 6509.412 | 5908.814 | 5883.871 | 6295.754 |
| 182 | 6877.753 | 6755.769 | 6099.74 | 6706.829 | 6492.698 | 5818.605 | 6111.083 | 5993.819 | 7642.52 | 5867.288 | 6509.412 | 5908.814 | 5883.871 | 6295.754 |
| 183 | 6876.373 | 6755.769 | 6099.74 | 6706.829 | 6492.698 | 5818.605 | 6110.34 | 5984.011 | 7642.52 | 5867.288 | 6509.412 | 5908.814 | 5883.871 | 6295.754 |
| 184 | 6875.248 | 6755.769 | 6099.74 | 6706.829 | 6492.698 | 5818.605 | 6109.597 | 5974.236 | 7642.52 | 5867.288 | 6509.412 | 5908.814 | 5883.871 | 6295.754 |
| 185 | 6874.376 | 6755.769 | 6099.74 | 6706.829 | 6492.698 | 5818.605 | 6108.855 | 5964.492 | 7642.52 | 5867.288 | 6509.412 | 5908.814 | 5883.871 | 6295.754 |
| 186 | 6873.759 | 6755.769 | 6099.74 | 6706.829 | 6492.698 | 5818.605 | 6108.112 | 5956.166 | 7642.52 | 5867.288 | 6509.412 | 5908.814 | 5883.871 | 6295.754 |
| 187 | 6873.396 | 6755.769 | 6099.74 | 6706.829 | 6492.698 | 5818.605 | 6107.37 | 5946.481 | 7642.52 | 5867.288 | 6509.412 | 5908.814 | 5883.871 | 6295.754 |
| 188 | 6873.288 | 6755.769 | 6099.74 | 6706.829 | 6492.698 | 5818.605 | 6106.628 | 5936.827 | 7642.52 | 5867.288 | 6509.412 | 5908.814 | 5883.871 | 6295.754 |
| 189 | 6873.433 | 6755.769 | 6099.74 | 6706.829 | 6492.698 | 5818.605 | 6105.887 | 5925.833 | 7642.52 | 5867.288 | 6509.412 | 5908.814 | 5883.871 | 6295.754 |
| 190 | 6870.712 | 6755.769 | 6099.74 | 6706.829 | 6492.698 | 5818.605 | 6105.145 | 5916.247 | 7642.52 | 5867.288 | 6509.412 | 5908.814 | 5883.871 | 6295.754 |
| 191 | 6870.712 | 6755.769 | 6099.74 | 6706.829 | 6492.698 | 5818.605 | 6104.404 | 5906.691 | 7642.52 | 5867.288 | 6509.412 | 5908.814 | 5883.871 | 6295.754 |
| 192 | 6870.712 | 6755.769 | 6099.74 | 6706.829 | 6492.698 | 5818.605 | 6103.663 | 5895.808 | 7642.52 | 5867.288 | 6509.412 | 5908.814 | 5883.871 | 6295.754 |
| 193 | 6870.712 | 6755.769 | 6099.74 | 6706.829 | 6492.698 | 5818.605 | 6102.922 | 5886.319 | 7642.52 | 5867.288 | 6509.412 | 5908.814 | 5883.871 | 6295.754 |
| 194 | 6870.712 | 6755.769 | 6099.74 | 6706.829 | 6492.698 | 5818.605 | 6102.181 | 5875.511 | 7642.52 | 5867.288 | 6509.412 | 5908.814 | 5883.871 | 6295.754 |
| 195 | 6870.712 | 6755.769 | 6099.74 | 6706.829 | 6492.698 | 5818.605 | 6101.44 | 5864.742 | 7642.52 | 5867.288 | 6509.412 | 5908.814 | 5883.871 | 6295.754 |
| 196 | 6870.712 | 6755.769 | 6099.74 | 6706.829 | 6492.698 | 5818.605 | 6100.7 | 5854.013 | 7642.52 | 5867.288 | 6509.412 | 5908.814 | 5883.871 | 6295.754 |
| 197 | 6870.712 | 6755.769 | 6099.74 | 6706.829 | 6492.698 | 5818.605 | 6099.959 | 5843.323 | 7642.52 | 5867.288 | 6509.412 | 5908.814 | 5883.871 | 6295.754 |
| 198 | 6870.712 | 6755.769 | 6099.74 | 6706.829 | 6492.698 | 5818.605 | 6099.219 | 5832.673 | 7642.52 | 5867.288 | 6509.412 | 5908.814 | 5883.871 | 6295.754 |
| 199 | 6870.712 | 6755.769 | 6099.74 | 6706.829 | 6492.698 | 5818.605 | 6098.479 | 5822.06 | 7642.52 | 5867.288 | 6509.412 | 5908.814 | 5883.871 | 6295.754 |
| 200 | 6870.712 | 6755.769 | 6099.74 | 6706.829 | 6492.698 | 5818.605 | 6097.74 | 5811.487 | 7642.52 | 5867.288 | 6509.412 | 5908.814 | 5883.871 | 6295.754 |
| 201 | 6870.712 | 6755.769 | 6099.74 | 6706.829 | 6492.698 | 5818.605 | 6097 | 5799.638 | 7642.52 | 5867.288 | 6509.412 | 5908.814 | 5883.871 | 6295.754 |
| 202 | 6870.712 | 6755.769 | 6099.74 | 6706.829 | 6492.698 | 5818.605 | 6096.261 | 5789.145 | 7642.52 | 5867.288 | 6509.412 | 5908.814 | 5883.871 | 6295.754 |
| 203 | 6870.712 | 6755.769 | 6099.74 | 6706.829 | 6492.698 | 5818.605 | 6095.521 | 5777.387 | 7642.52 | 5867.288 | 6509.412 | 5908.814 | 5883.871 | 6295.754 |
| 204 | 6870.712 | 6755.769 | 6099.74 | 6706.829 | 6492.698 | 5818.605 | 6094.782 | 5765.676 | 7642.52 | 5867.288 | 6509.412 | 5908.814 | 5883.871 | 6295.754 |
| 205 | 6870.712 | 6755.769 | 6099.74 | 6706.829 | 6492.698 | 5818.605 | 6094.043 | 5754.012 | 7642.52 | 5867.288 | 6509.412 | 5908.814 | 5883.871 | 6295.754 |
| 206 | 6870.712 | 6755.769 | 6099.74 | 6706.829 | 6492.698 | 5818.605 | 6093.305 | 5742.396 | 7642.52 | 5867.288 | 6509.412 | 5908.814 | 5883.871 | 6295.754 |
| 207 | 6870.712 | 6755.769 | 6099.74 | 6706.829 | 6492.698 | 5818.605 | 6092.566 | 5729.543 | 7642.52 | 5867.288 | 6509.412 | 5908.814 | 5883.871 | 6295.754 |
| 208 | 6870.712 | 6755.769 | 6099.74 | 6706.829 | 6492.698 | 5818.605 | 6091.828 | 5718.025 | 7642.52 | 5867.288 | 6509.412 | 5908.814 | 5883.871 | 6295.754 |
| 209 | 6870.712 | 6755.769 | 6099.74 | 6706.829 | 6492.698 | 5818.605 | 6091.09 | 5705.282 | 7642.52 | 5867.288 | 6509.412 | 5908.814 | 5883.871 | 6295.754 |
| 210 | 6870.712 | 6755.769 | 6099.74 | 6706.829 | 6492.698 | 5818.605 | 6090.352 | 5693.861 | 7642.52 | 5867.288 | 6509.412 | 5908.814 | 5883.871 | 6295.754 |
| 211 | 6870.712 | 6755.769 | 6099.74 | 6706.829 | 6492.698 | 5818.605 | 6089.614 | 5681.225 | 7642.52 | 5867.288 | 6509.412 | 5908.814 | 5883.871 | 6295.754 |
| 212 | 6870.712 | 6755.769 | 6099.74 | 6706.829 | 6492.698 | 5818.605 | 6088.877 | 5668.645 | 7642.52 | 5867.288 | 6509.412 | 5908.814 | 5883.871 | 6295.754 |
| 213 | 6870.712 | 6755.769 | 6099.74 | 6706.829 | 6492.698 | 5818.605 | 6088.139 | 5656.12 | 7642.52 | 5867.288 | 6509.412 | 5908.814 | 5883.871 | 6295.754 |
| 214 | 6870.712 | 6755.769 | 6099.74 | 6706.829 | 6492.698 | 5818.605 | 6087.402 | 5642.407 | 7642.52 | 5867.288 | 6509.412 | 5908.814 | 5883.871 | 6295.754 |
| 215 | 6870.712 | 6755.769 | 6099.74 | 6706.829 | 6492.698 | 5818.605 | 6086.665 | 5629.998 | 7642.52 | 5867.288 | 6509.412 | 5908.814 | 5883.871 | 6295.754 |
| 216 | 6870.712 | 6755.769 | 6099.74 | 6706.829 | 6492.698 | 5818.605 | 6085.928 | 5616.411 | 7642.52 | 5867.288 | 6509.412 | 5908.814 | 5883.871 | 6295.754 |
| 217 | 6870.712 | 6755.769 | 6099.74 | 6706.829 | 6492.698 | 5818.605 | 6085.191 | 5602.889 | 7642.52 | 5867.288 | 6509.412 | 5908.814 | 5883.871 | 6295.754 |
| 218 | 6870.712 | 6755.769 | 6099.74 | 6706.829 | 6492.698 | 5818.605 | 6084.455 | 5589.432 | 7642.52 | 5867.288 | 6509.412 | 5908.814 | 5883.871 | 6295.754 |
| 219 | 6870.712 | 6755.769 | 6099.74 | 6706.829 | 6492.698 | 5818.605 | 6083.718 | 5576.04 | 7642.52 | 5867.288 | 6509.412 | 5908.814 | 5883.871 | 6295.754 |
| 220 | 6870.712 | 6755.769 | 6099.74 | 6706.829 | 6492.698 | 5818.605 | 6082.982 | 5562.712 | 7642.52 | 5867.288 | 6509.412 | 5908.814 | 5883.871 | 6295.754 |
| 221 | 6870.712 | 6755.769 | 6099.74 | 6706.829 | 6492.698 | 5818.605 | 6082.246 | 5548.244 | 7642.52 | 5867.288 | 6509.412 | 5908.814 | 5883.871 | 6295.754 |
| 222 | 6870.712 | 6755.769 | 6099.74 | 6706.829 | 6492.698 | 5818.605 | 6081.51 | 5533.852 | 7642.52 | 5867.288 | 6509.412 | 5908.814 | 5883.871 | 6295.754 |
| 223 | 6870.712 | 6755.769 | 6099.74 | 6706.829 | 6492.698 | 5818.605 | 6080.775 | 5520.725 | 7642.52 | 5867.288 | 6509.412 | 5908.814 | 5883.871 | 6295.754 |
| 224 | 6870.712 | 6755.769 | 6099.74 | 6706.829 | 6492.698 | 5818.605 | 6080.039 | 5506.475 | 7642.52 | 5867.288 | 6509.412 | 5908.814 | 5883.871 | 6295.754 |
| 225 | 6870.712 | 6755.769 | 6099.74 | 6706.829 | 6492.698 | 5818.605 | 6079.304 | 5491.12 | 7642.52 | 5867.288 | 6509.412 | 5908.814 | 5883.871 | 6295.754 |
| 226 | 6870.712 | 6755.769 | 6099.74 | 6706.829 | 6492.698 | 5818.605 | 6078.569 | 5477.022 | 7642.52 | 5867.288 | 6509.412 | 5908.814 | 5883.871 | 6295.754 |
| 227 | 6870.712 | 6755.769 | 6099.74 | 6706.829 | 6492.698 | 5818.605 | 6077.834 | 5461.831 | 7642.52 | 5867.288 | 6509.412 | 5908.814 | 5883.871 | 6295.754 |
| 228 | 6870.712 | 6755.769 | 6099.74 | 6706.829 | 6492.698 | 5818.605 | 6077.099 | 5446.723 | 7642.52 | 5867.288 | 6509.412 | 5908.814 | 5883.871 | 6295.754 |
| 229 | 6870.712 | 6755.769 | 6099.74 | 6706.829 | 6492.698 | 5818.605 | 6076.365 | 5431.7 | 7642.52 | 5867.288 | 6509.412 | 5908.814 | 5883.871 | 6295.754 |
| 230 | 6870.712 | 6755.769 | 6099.74 | 6706.829 | 6492.698 | 5818.605 | 6075.63 | 5416.758 | 7642.52 | 5867.288 | 6509.412 | 5908.814 | 5883.871 | 6295.754 |
| 231 | 6870.712 | 6755.769 | 6099.74 | 6706.829 | 6492.698 | 5818.605 | 6074.896 | 5401.899 | 7642.52 | 5867.288 | 6509.412 | 5908.814 | 5883.871 | 6295.754 |
| 232 | 6870.712 | 6755.769 | 6099.74 | 6706.829 | 6492.698 | 5818.605 | 6074.162 | 5385.988 | 7642.52 | 5867.288 | 6509.412 | 5908.814 | 5883.871 | 6295.754 |
| 233 | 6870.712 | 6755.769 | 6099.74 | 6706.829 | 6492.698 | 5818.605 | 6073.428 | 5370.17 | 7642.52 | 5867.288 | 6509.412 | 5908.814 | 5883.871 | 6295.754 |
| 234 | 6870.712 | 6755.769 | 6099.74 | 6706.829 | 6492.698 | 5818.605 | 6072.694 | 5354.445 | 7642.52 | 5867.288 | 6509.412 | 5908.814 | 5883.871 | 6295.754 |
| 235 | 6870.712 | 6755.769 | 6099.74 | 6706.829 | 6492.698 | 5818.605 | 6071.961 | 5338.811 | 7642.52 | 5867.288 | 6509.412 | 5908.814 | 5883.871 | 6295.754 |
| 236 | 6870.712 | 6755.769 | 6099.74 | 6706.829 | 6492.698 | 5818.605 | 6071.228 | 5322.162 | 7642.52 | 5867.288 | 6509.412 | 5908.814 | 5883.871 | 6295.754 |
| 237 | 6870.712 | 6755.769 | 6099.74 | 6706.829 | 6492.698 | 5818.605 | 6070.494 | 5305.617 | 7642.52 | 5867.288 | 6509.412 | 5908.814 | 5883.871 | 6295.754 |
| 238 | 6870.712 | 6755.769 | 6099.74 | 6706.829 | 6492.698 | 5818.605 | 6069.761 | 5290.267 | 7642.52 | 5867.288 | 6509.412 | 5908.814 | 5883.871 | 6295.754 |
| 239 | 6870.712 | 6755.769 | 6099.74 | 6706.829 | 6492.698 | 5818.605 | 6069.029 | 5272.832 | 7642.52 | 5867.288 | 6509.412 | 5908.814 | 5883.871 | 6295.754 |
| 240 | 6870.712 | 6755.769 | 6099.74 | 6706.829 | 6492.698 | 5818.605 | 6068.296 | 5256.591 | 7642.52 | 5867.288 | 6509.412 | 5908.814 | 5883.871 | 6295.754 |
| 241 | 6870.712 | 6755.769 | 6099.74 | 6706.829 | 6492.698 | 5818.605 | 6067.564 | 5239.378 | 7642.52 | 5867.288 | 6509.412 | 5908.814 | 5883.871 | 6295.754 |
| 242 | 6870.712 | 6755.769 | 6099.74 | 6706.829 | 6492.698 | 5818.605 | 6066.831 | 5222.277 | 7642.52 | 5867.288 | 6509.412 | 5908.814 | 5883.871 | 6295.754 |
| 243 | 6870.712 | 6755.769 | 6099.74 | 6706.829 | 6492.698 | 5818.605 | 6066.099 | 5205.287 | 7642.52 | 5867.288 | 6509.412 | 5908.814 | 5883.871 | 6295.754 |
| 244 | 6870.712 | 6755.769 | 6099.74 | 6706.829 | 6492.698 | 5818.605 | 6065.367 | 5188.407 | 7642.52 | 5867.288 | 6509.412 | 5908.814 | 5883.871 | 6295.754 |
| 245 | 6870.712 | 6755.769 | 6099.74 | 6706.829 | 6492.698 | 5818.605 | 6064.636 | 5170.592 | 7642.52 | 5867.288 | 6509.412 | 5908.814 | 5883.871 | 6295.754 |
| 246 | 6870.712 | 6755.769 | 6099.74 | 6706.829 | 6492.698 | 5818.605 | 6063.904 | 5153.936 | 7642.52 | 5867.288 | 6509.412 | 5908.814 | 5883.871 | 6295.754 |
| 247 | 6870.712 | 6755.769 | 6099.74 | 6706.829 | 6492.698 | 5818.605 | 6063.173 | 5136.356 | 7642.52 | 5867.288 | 6509.412 | 5908.814 | 5883.871 | 6295.754 |
| 248 | 6870.712 | 6755.769 | 6099.74 | 6706.829 | 6492.698 | 5818.605 | 6062.441 | 5117.873 | 7642.52 | 5867.288 | 6509.412 | 5908.814 | 5883.871 | 6295.754 |
| 249 | 6870.712 | 6755.769 | 6099.74 | 6706.829 | 6492.698 | 5818.605 | 6061.71 | 5100.538 | 7642.52 | 5867.288 | 6509.412 | 5908.814 | 5883.871 | 6295.754 |
| 250 | 6870.712 | 6755.769 | 6099.74 | 6706.829 | 6492.698 | 5818.605 | 6060.98 | 5100.538 | 7642.52 | 5867.288 | 6509.412 | 5908.814 | 5883.871 | 6295.754 |
| 251 | 6870.712 | 6755.769 | 6099.74 | 6706.829 | 6492.698 | 5818.605 | 6060.249 | 5100.538 | 7642.52 | 5867.288 | 6509.412 | 5908.814 | 5883.871 | 6295.754 |
| 252 | 6870.712 | 6755.769 | 6099.74 | 6706.829 | 6492.698 | 5818.605 | 6059.518 | 5100.538 | 7642.52 | 5867.288 | 6509.412 | 5908.814 | 5883.871 | 6295.754 |
| 253 | 6870.712 | 6755.769 | 6099.74 | 6706.829 | 6492.698 | 5818.605 | 6058.788 | 5100.538 | 7642.52 | 5867.288 | 6509.412 | 5908.814 | 5883.871 | 6295.754 |
| 254 | 6870.712 | 6755.769 | 6099.74 | 6706.829 | 6492.698 | 5818.605 | 6058.058 | 5100.538 | 7642.52 | 5867.288 | 6509.412 | 5908.814 | 5883.871 | 6295.754 |
| 255 | 6870.712 | 6755.769 | 6099.74 | 6706.829 | 6492.698 | 5818.605 | 6057.328 | 5100.538 | 7642.52 | 5867.288 | 6509.412 | 5908.814 | 5883.871 | 6295.754 |
| 256 | 6870.712 | 6755.769 | 6099.74 | 6706.829 | 6492.698 | 5818.605 | 6056.598 | 5100.538 | 7642.52 | 5867.288 | 6509.412 | 5908.814 | 5883.871 | 6295.754 |
| 257 | 6870.712 | 6755.769 | 6099.74 | 6706.829 | 6492.698 | 5818.605 | 6055.869 | 5100.538 | 7642.52 | 5867.288 | 6509.412 | 5908.814 | 5883.871 | 6295.754 |
| 258 | 6870.712 | 6755.769 | 6099.74 | 6706.829 | 6492.698 | 5818.605 | 6055.139 | 5100.538 | 7642.52 | 5867.288 | 6509.412 | 5908.814 | 5883.871 | 6295.754 |
| 259 | 6870.712 | 6755.769 | 6099.74 | 6706.829 | 6492.698 | 5818.605 | 6054.41 | 5100.538 | 7642.52 | 5867.288 | 6509.412 | 5908.814 | 5883.871 | 6295.754 |
| 260 | 6870.712 | 6755.769 | 6099.74 | 6706.829 | 6492.698 | 5818.605 | 6053.681 | 5100.538 | 7642.52 | 5867.288 | 6509.412 | 5908.814 | 5883.871 | 6295.754 |
| 261 | 6870.712 | 6755.769 | 6099.74 | 6706.829 | 6492.698 | 5818.605 | 6052.952 | 5100.538 | 7642.52 | 5867.288 | 6509.412 | 5908.814 | 5883.871 | 6295.754 |
| 262 | 6870.712 | 6755.769 | 6099.74 | 6706.829 | 6492.698 | 5818.605 | 6052.223 | 5100.538 | 7642.52 | 5867.288 | 6509.412 | 5908.814 | 5883.871 | 6295.754 |
| 263 | 6870.712 | 6755.769 | 6099.74 | 6706.829 | 6492.698 | 5818.605 | 6051.494 | 5100.538 | 7642.52 | 5867.288 | 6509.412 | 5908.814 | 5883.871 | 6295.754 |
| 264 | 6870.712 | 6755.769 | 6099.74 | 6706.829 | 6492.698 | 5818.605 | 6050.766 | 5100.538 | 7642.52 | 5867.288 | 6509.412 | 5908.814 | 5883.871 | 6295.754 |
| 265 | 6870.712 | 6755.769 | 6099.74 | 6706.829 | 6492.698 | 5818.605 | 6050.038 | 5100.538 | 7642.52 | 5867.288 | 6509.412 | 5908.814 | 5883.871 | 6295.754 |
| 266 | 6870.712 | 6755.769 | 6099.74 | 6706.829 | 6492.698 | 5818.605 | 6049.31 | 5100.538 | 7642.52 | 5867.288 | 6509.412 | 5908.814 | 5883.871 | 6295.754 |
| 267 | 6870.712 | 6755.769 | 6099.74 | 6706.829 | 6492.698 | 5818.605 | 6048.582 | 5100.538 | 7642.52 | 5867.288 | 6509.412 | 5908.814 | 5883.871 | 6295.754 |
| 268 | 6870.712 | 6755.769 | 6099.74 | 6706.829 | 6492.698 | 5818.605 | 6047.854 | 5100.538 | 7642.52 | 5867.288 | 6509.412 | 5908.814 | 5883.871 | 6295.754 |
| 269 | 6870.712 | 6755.769 | 6099.74 | 6706.829 | 6492.698 | 5818.605 | 6047.127 | 5100.538 | 7642.52 | 5867.288 | 6509.412 | 5908.814 | 5883.871 | 6295.754 |
| 270 | 6870.712 | 6755.769 | 6099.74 | 6706.829 | 6492.698 | 5818.605 | 6046.399 | 5100.538 | 7642.52 | 5867.288 | 6509.412 | 5908.814 | 5883.871 | 6295.754 |
| 271 | 6870.712 | 6755.769 | 6099.74 | 6706.829 | 6492.698 | 5818.605 | 6045.672 | 5100.538 | 7642.52 | 5867.288 | 6509.412 | 5908.814 | 5883.871 | 6295.754 |
| 272 | 6870.712 | 6755.769 | 6099.74 | 6706.829 | 6492.698 | 5818.605 | 6044.945 | 5100.538 | 7642.52 | 5867.288 | 6509.412 | 5908.814 | 5883.871 | 6295.754 |
| 273 | 6870.712 | 6755.769 | 6099.74 | 6706.829 | 6492.698 | 5818.605 | 6044.218 | 5100.538 | 7642.52 | 5867.288 | 6509.412 | 5908.814 | 5883.871 | 6295.754 |
| 274 | 6870.712 | 6755.769 | 6099.74 | 6706.829 | 6492.698 | 5818.605 | 6043.492 | 5100.538 | 7642.52 | 5867.288 | 6509.412 | 5908.814 | 5883.871 | 6295.754 |
| 275 | 6870.712 | 6755.769 | 6099.74 | 6706.829 | 6492.698 | 5818.605 | 6042.765 | 5100.538 | 7642.52 | 5867.288 | 6509.412 | 5908.814 | 5883.871 | 6295.754 |
| 276 | 6870.712 | 6755.769 | 6099.74 | 6706.829 | 6492.698 | 5818.605 | 6042.039 | 5100.538 | 7642.52 | 5867.288 | 6509.412 | 5908.814 | 5883.871 | 6295.754 |
| 277 | 6870.712 | 6755.769 | 6099.74 | 6706.829 | 6492.698 | 5818.605 | 6041.313 | 5100.538 | 7642.52 | 5867.288 | 6509.412 | 5908.814 | 5883.871 | 6295.754 |
| 278 | 6870.712 | 6755.769 | 6099.74 | 6706.829 | 6492.698 | 5818.605 | 6040.587 | 5100.538 | 7642.52 | 5867.288 | 6509.412 | 5908.814 | 5883.871 | 6295.754 |
| 279 | 6870.712 | 6755.769 | 6099.74 | 6706.829 | 6492.698 | 5818.605 | 6039.861 | 5100.538 | 7642.52 | 5867.288 | 6509.412 | 5908.814 | 5883.871 | 6295.754 |
| 280 | 6870.712 | 6755.769 | 6099.74 | 6706.829 | 6492.698 | 5818.605 | 6039.136 | 5100.538 | 7642.52 | 5867.288 | 6509.412 | 5908.814 | 5883.871 | 6295.754 |
| 281 | 6870.712 | 6755.769 | 6099.74 | 6706.829 | 6492.698 | 5818.605 | 6038.41 | 5100.538 | 7642.52 | 5867.288 | 6509.412 | 5908.814 | 5883.871 | 6295.754 |
| 282 | 6870.712 | 6755.769 | 6099.74 | 6706.829 | 6492.698 | 5818.605 | 6037.685 | 5100.538 | 7642.52 | 5867.288 | 6509.412 | 5908.814 | 5883.871 | 6295.754 |
| 283 | 6870.712 | 6755.769 | 6099.74 | 6706.829 | 6492.698 | 5818.605 | 6036.96 | 5100.538 | 7642.52 | 5867.288 | 6509.412 | 5908.814 | 5883.871 | 6295.754 |
| 284 | 6870.712 | 6755.769 | 6099.74 | 6706.829 | 6492.698 | 5818.605 | 6036.235 | 5100.538 | 7642.52 | 5867.288 | 6509.412 | 5908.814 | 5883.871 | 6295.754 |
| 285 | 6870.712 | 6755.769 | 6099.74 | 6706.829 | 6492.698 | 5818.605 | 6035.51 | 5100.538 | 7642.52 | 5867.288 | 6509.412 | 5908.814 | 5883.871 | 6295.754 |
| 286 | 6870.712 | 6755.769 | 6099.74 | 6706.829 | 6492.698 | 5818.605 | 6034.786 | 5100.538 | 7642.52 | 5867.288 | 6509.412 | 5908.814 | 5883.871 | 6295.754 |
| 287 | 6870.712 | 6755.769 | 6099.74 | 6706.829 | 6492.698 | 5818.605 | 6034.061 | 5100.538 | 7642.52 | 5867.288 | 6509.412 | 5908.814 | 5883.871 | 6295.754 |
| 288 | 6870.712 | 6755.769 | 6099.74 | 6706.829 | 6492.698 | 5818.605 | 6033.337 | 5100.538 | 7642.52 | 5867.288 | 6509.412 | 5908.814 | 5883.871 | 6295.754 |
| 289 | 6870.712 | 6755.769 | 6099.74 | 6706.829 | 6492.698 | 5818.605 | 6032.613 | 5100.538 | 7642.52 | 5867.288 | 6509.412 | 5908.814 | 5883.871 | 6295.754 |
| 290 | 6870.712 | 6755.769 | 6099.74 | 6706.829 | 6492.698 | 5818.605 | 6031.889 | 5100.538 | 7642.52 | 5867.288 | 6509.412 | 5908.814 | 5883.871 | 6295.754 |
| 291 | 6870.712 | 6755.769 | 6099.74 | 6706.829 | 6492.698 | 5818.605 | 6031.166 | 5100.538 | 7642.52 | 5867.288 | 6509.412 | 5908.814 | 5883.871 | 6295.754 |
| 292 | 6870.712 | 6755.769 | 6099.74 | 6706.829 | 6492.698 | 5818.605 | 6030.442 | 5100.538 | 7642.52 | 5867.288 | 6509.412 | 5908.814 | 5883.871 | 6295.754 |
| 293 | 6870.712 | 6755.769 | 6099.74 | 6706.829 | 6492.698 | 5818.605 | 6029.719 | 5100.538 | 7642.52 | 5867.288 | 6509.412 | 5908.814 | 5883.871 | 6295.754 |
| 294 | 6870.712 | 6755.769 | 6099.74 | 6706.829 | 6492.698 | 5818.605 | 6028.996 | 5100.538 | 7642.52 | 5867.288 | 6509.412 | 5908.814 | 5883.871 | 6295.754 |
| 295 | 6870.712 | 6755.769 | 6099.74 | 6706.829 | 6492.698 | 5818.605 | 6028.273 | 5100.538 | 7642.52 | 5867.288 | 6509.412 | 5908.814 | 5883.871 | 6295.754 |
| 296 | 6870.712 | 6755.769 | 6099.74 | 6706.829 | 6492.698 | 5818.605 | 6027.55 | 5100.538 | 7642.52 | 5867.288 | 6509.412 | 5908.814 | 5883.871 | 6295.754 |
| 297 | 6870.712 | 6755.769 | 6099.74 | 6706.829 | 6492.698 | 5818.605 | 6026.827 | 5100.538 | 7642.52 | 5867.288 | 6509.412 | 5908.814 | 5883.871 | 6295.754 |
| 298 | 6870.712 | 6755.769 | 6099.74 | 6706.829 | 6492.698 | 5818.605 | 6026.105 | 5100.538 | 7642.52 | 5867.288 | 6509.412 | 5908.814 | 5883.871 | 6295.754 |
| 299 | 6870.712 | 6755.769 | 6099.74 | 6706.829 | 6492.698 | 5818.605 | 6025.382 | 5100.538 | 7642.52 | 5867.288 | 6509.412 | 5908.814 | 5883.871 | 6295.754 |